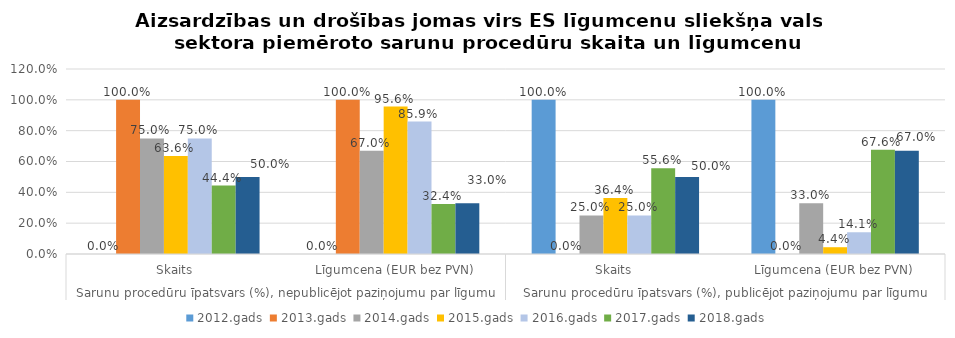
| Category | 2012.gads | 2013.gads | 2014.gads | 2015.gads | 2016.gads | 2017.gads | 2018.gads |
|---|---|---|---|---|---|---|---|
| 0 | 0 | 1 | 0.75 | 0.636 | 0.75 | 0.444 | 0.5 |
| 1 | 0 | 1 | 0.67 | 0.956 | 0.859 | 0.324 | 0.33 |
| 2 | 1 | 0 | 0.25 | 0.364 | 0.25 | 0.556 | 0.5 |
| 3 | 1 | 0 | 0.33 | 0.044 | 0.141 | 0.676 | 0.67 |